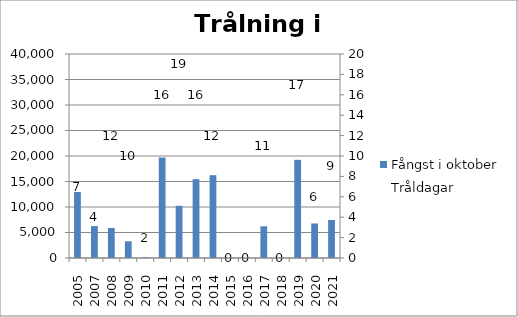
| Category | Fångst i oktober |
|---|---|
| 2005.0 | 12945 |
| 2007.0 | 6260 |
| 2008.0 | 5890 |
| 2009.0 | 3270 |
| 2010.0 | 130 |
| 2011.0 | 19700 |
| 2012.0 | 10230 |
| 2013.0 | 15455 |
| 2014.0 | 16235 |
| 2015.0 | 0 |
| 2016.0 | 0 |
| 2017.0 | 6215 |
| 2018.0 | 0 |
| 2019.0 | 19250 |
| 2020.0 | 6770 |
| 2021.0 | 7455 |